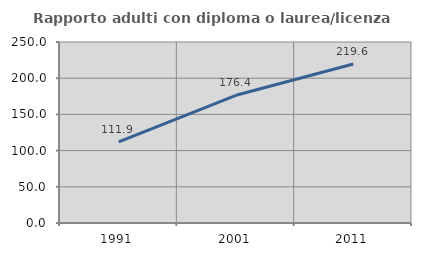
| Category | Rapporto adulti con diploma o laurea/licenza media  |
|---|---|
| 1991.0 | 111.905 |
| 2001.0 | 176.41 |
| 2011.0 | 219.635 |